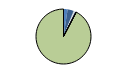
| Category | Series 0 |
|---|---|
| ARRASTRE | 20 |
| CERCO | 29 |
| ATUNEROS CAÑEROS | 2 |
| PALANGRE DE FONDO | 5 |
| PALANGRE DE SUPERFICIE | 6 |
| RASCO | 0 |
| VOLANTA | 1 |
| ARTES FIJAS | 1 |
| ARTES MENORES | 767 |